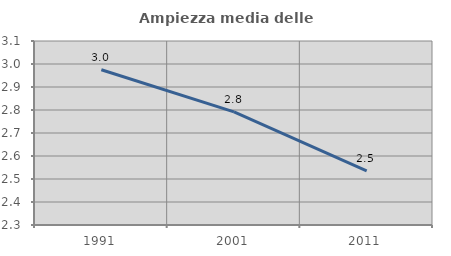
| Category | Ampiezza media delle famiglie |
|---|---|
| 1991.0 | 2.975 |
| 2001.0 | 2.792 |
| 2011.0 | 2.536 |